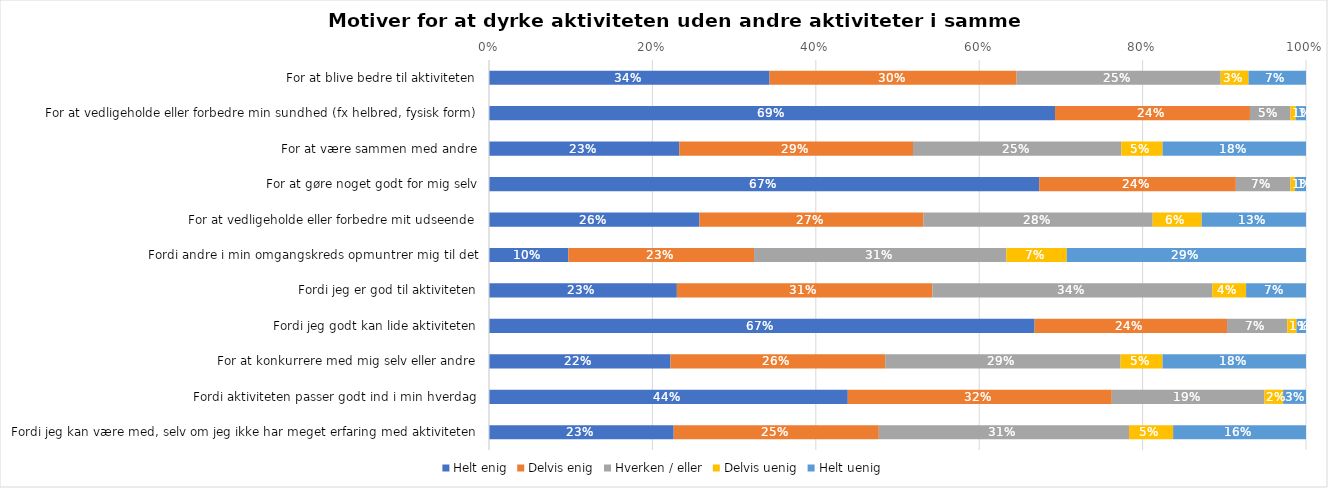
| Category | Helt enig | Delvis enig | Hverken / eller | Delvis uenig | Helt uenig |
|---|---|---|---|---|---|
| For at blive bedre til aktiviteten | 0.343 | 0.302 | 0.25 | 0.034 | 0.07 |
| For at vedligeholde eller forbedre min sundhed (fx helbred, fysisk form) | 0.693 | 0.239 | 0.05 | 0.006 | 0.013 |
| For at være sammen med andre | 0.233 | 0.286 | 0.255 | 0.05 | 0.176 |
| For at gøre noget godt for mig selv | 0.673 | 0.241 | 0.067 | 0.006 | 0.013 |
| For at vedligeholde eller forbedre mit udseende | 0.258 | 0.274 | 0.28 | 0.06 | 0.128 |
| Fordi andre i min omgangskreds opmuntrer mig til det | 0.097 | 0.227 | 0.309 | 0.074 | 0.293 |
| Fordi jeg er god til aktiviteten | 0.23 | 0.313 | 0.343 | 0.041 | 0.073 |
| Fordi jeg godt kan lide aktiviteten | 0.668 | 0.236 | 0.074 | 0.011 | 0.012 |
| For at konkurrere med mig selv eller andre | 0.222 | 0.263 | 0.288 | 0.051 | 0.176 |
| Fordi aktiviteten passer godt ind i min hverdag | 0.439 | 0.323 | 0.187 | 0.023 | 0.028 |
| Fordi jeg kan være med, selv om jeg ikke har meget erfaring med aktiviteten | 0.226 | 0.251 | 0.306 | 0.054 | 0.163 |